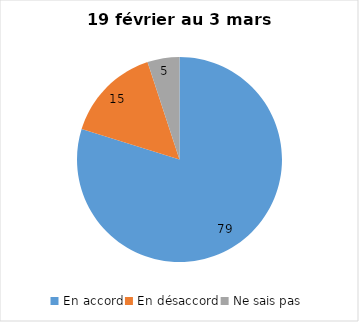
| Category | Series 0 |
|---|---|
| En accord | 79 |
| En désaccord | 15 |
| Ne sais pas | 5 |